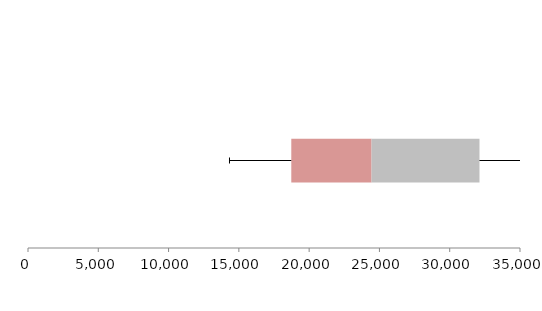
| Category | Series 1 | Series 2 | Series 3 |
|---|---|---|---|
| 0 | 18730.144 | 5710.806 | 7676.788 |